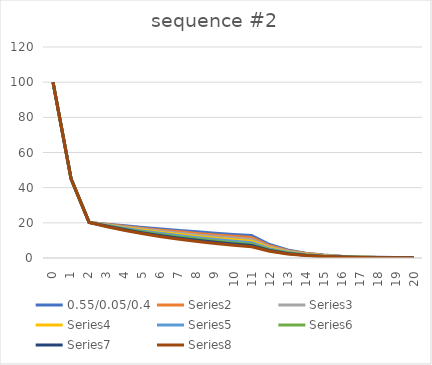
| Category | 0.55/0.05/0.4 | Series 1 | Series 2 | Series 3 | Series 4 | Series 5 | Series 6 | Series 7 |
|---|---|---|---|---|---|---|---|---|
| 0.0 | 100 | 100 | 100 | 100 | 100 | 100 | 100 | 100 |
| 1.0 | 45 | 45 | 45 | 45 | 45 | 45 | 45 | 45 |
| 2.0 | 20.25 | 20.25 | 20.25 | 20.25 | 20.25 | 20.25 | 20.25 | 20.25 |
| 3.0 | 19.237 | 19.035 | 18.832 | 18.63 | 18.428 | 18.225 | 18.022 | 17.82 |
| 4.0 | 18.276 | 17.893 | 17.514 | 17.14 | 16.769 | 16.402 | 16.04 | 15.682 |
| 5.0 | 17.362 | 16.819 | 16.288 | 15.768 | 15.26 | 14.762 | 14.276 | 13.8 |
| 6.0 | 16.494 | 15.81 | 15.148 | 14.507 | 13.886 | 13.286 | 12.705 | 12.144 |
| 7.0 | 15.669 | 14.862 | 14.088 | 13.346 | 12.637 | 11.957 | 11.308 | 10.687 |
| 8.0 | 14.886 | 13.97 | 13.102 | 12.279 | 11.499 | 10.762 | 10.064 | 9.404 |
| 9.0 | 14.141 | 13.132 | 12.184 | 11.296 | 10.464 | 9.686 | 8.957 | 8.276 |
| 10.0 | 13.434 | 12.344 | 11.332 | 10.393 | 9.523 | 8.717 | 7.972 | 7.283 |
| 11.0 | 12.763 | 11.603 | 10.538 | 9.561 | 8.666 | 7.845 | 7.095 | 6.409 |
| 12.0 | 7.658 | 6.962 | 6.323 | 5.737 | 5.199 | 4.707 | 4.257 | 3.845 |
| 13.0 | 4.595 | 4.177 | 3.794 | 3.442 | 3.12 | 2.824 | 2.554 | 2.307 |
| 14.0 | 2.757 | 2.506 | 2.276 | 2.065 | 1.872 | 1.695 | 1.532 | 1.384 |
| 15.0 | 1.654 | 1.504 | 1.366 | 1.239 | 1.123 | 1.017 | 0.919 | 0.831 |
| 16.0 | 0.992 | 0.902 | 0.819 | 0.743 | 0.674 | 0.61 | 0.552 | 0.498 |
| 17.0 | 0.595 | 0.541 | 0.492 | 0.446 | 0.404 | 0.366 | 0.331 | 0.299 |
| 18.0 | 0.357 | 0.325 | 0.295 | 0.268 | 0.243 | 0.22 | 0.199 | 0.179 |
| 19.0 | 0.214 | 0.195 | 0.177 | 0.161 | 0.146 | 0.132 | 0.119 | 0.108 |
| 20.0 | 0.129 | 0.117 | 0.106 | 0.096 | 0.087 | 0.079 | 0.071 | 0.065 |